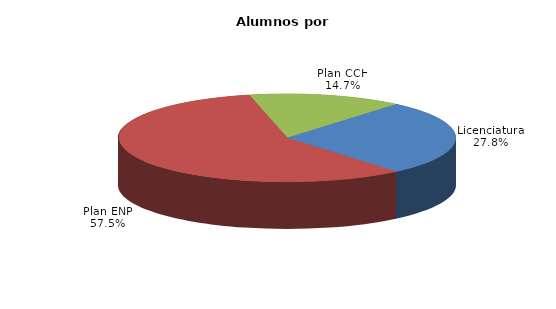
| Category | Series 0 |
|---|---|
| Licenciatura | 19312 |
| Plan ENP | 40033 |
| Plan CCH | 10240 |